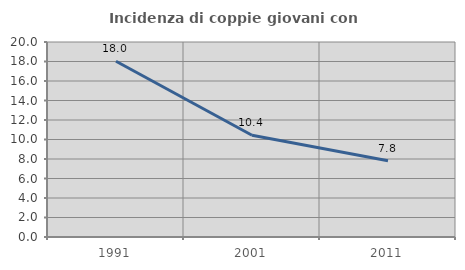
| Category | Incidenza di coppie giovani con figli |
|---|---|
| 1991.0 | 18.027 |
| 2001.0 | 10.44 |
| 2011.0 | 7.824 |